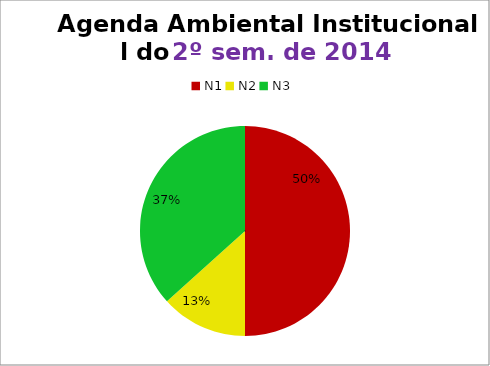
| Category | 2º/14 |
|---|---|
| N1 | 15 |
| N2 | 4 |
| N3 | 11 |